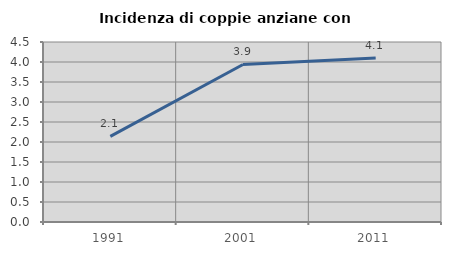
| Category | Incidenza di coppie anziane con figli |
|---|---|
| 1991.0 | 2.139 |
| 2001.0 | 3.939 |
| 2011.0 | 4.102 |